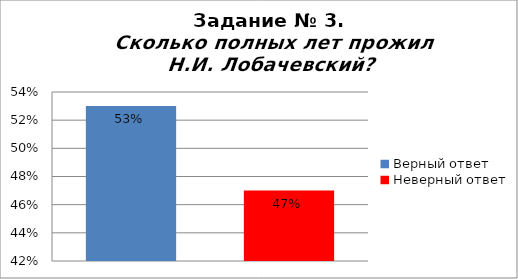
| Category | Сколько полных лет прожил Н.И. Лобачевский? |
|---|---|
| Верный ответ | 0.53 |
| Неверный ответ | 0.47 |